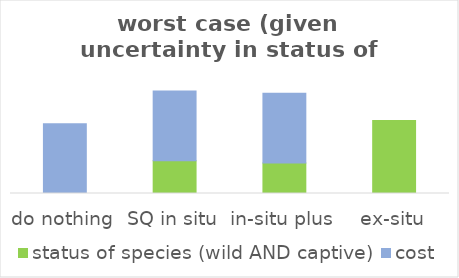
| Category | status of species (wild AND captive) | cost |
|---|---|---|
| do nothing | 0 | 0.231 |
| SQ in situ | 0.108 | 0.231 |
| in-situ plus | 0.1 | 0.231 |
| ex-situ | 0.242 | 0 |